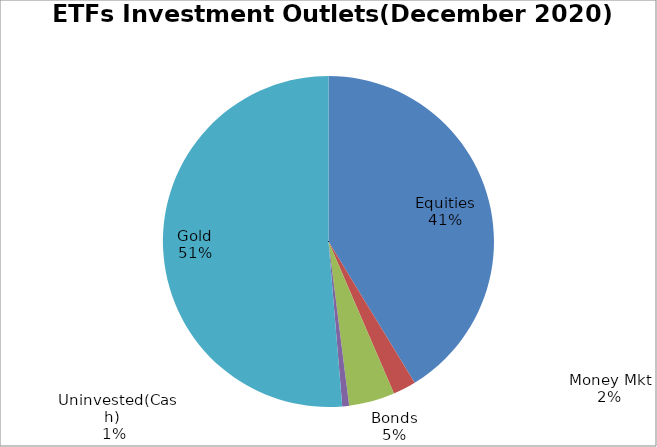
| Category | Series 0 |
|---|---|
| Equities | 6038222203.19 |
| Money Mkt | 328434807.13 |
| Bonds | 655620938.79 |
| Uninvested(Cash) | 97257264.43 |
| Gold | 7507451398.4 |